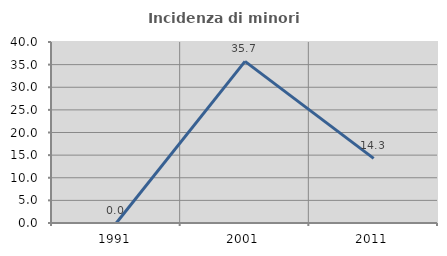
| Category | Incidenza di minori stranieri |
|---|---|
| 1991.0 | 0 |
| 2001.0 | 35.714 |
| 2011.0 | 14.286 |